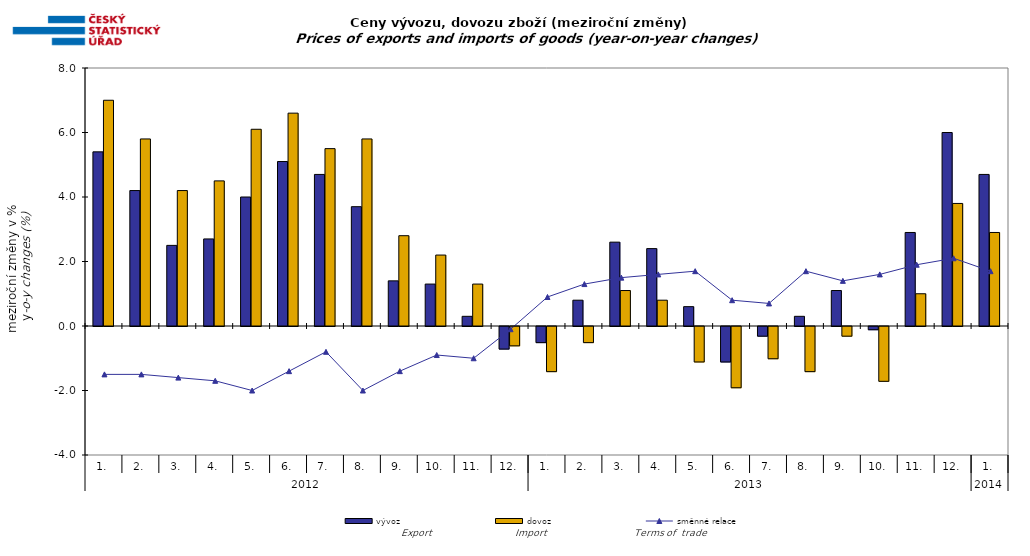
| Category | vývoz | dovoz |
|---|---|---|
| 0 | 5.4 | 7 |
| 1 | 4.2 | 5.8 |
| 2 | 2.5 | 4.2 |
| 3 | 2.7 | 4.5 |
| 4 | 4 | 6.1 |
| 5 | 5.1 | 6.6 |
| 6 | 4.7 | 5.5 |
| 7 | 3.7 | 5.8 |
| 8 | 1.4 | 2.8 |
| 9 | 1.3 | 2.2 |
| 10 | 0.3 | 1.3 |
| 11 | -0.7 | -0.6 |
| 12 | -0.5 | -1.4 |
| 13 | 0.8 | -0.5 |
| 14 | 2.6 | 1.1 |
| 15 | 2.4 | 0.8 |
| 16 | 0.6 | -1.1 |
| 17 | -1.1 | -1.9 |
| 18 | -0.3 | -1 |
| 19 | 0.3 | -1.4 |
| 20 | 1.1 | -0.3 |
| 21 | -0.1 | -1.7 |
| 22 | 2.9 | 1 |
| 23 | 6 | 3.8 |
| 24 | 4.7 | 2.9 |